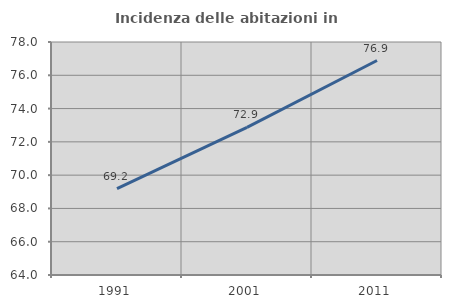
| Category | Incidenza delle abitazioni in proprietà  |
|---|---|
| 1991.0 | 69.195 |
| 2001.0 | 72.874 |
| 2011.0 | 76.887 |